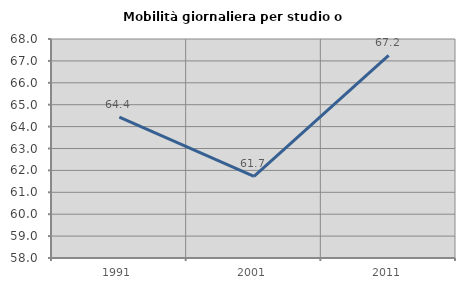
| Category | Mobilità giornaliera per studio o lavoro |
|---|---|
| 1991.0 | 64.429 |
| 2001.0 | 61.728 |
| 2011.0 | 67.25 |